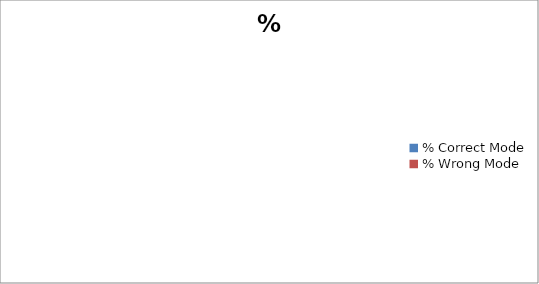
| Category | % Utilization |
|---|---|
| % Correct Mode | 0 |
| % Wrong Mode | 0 |